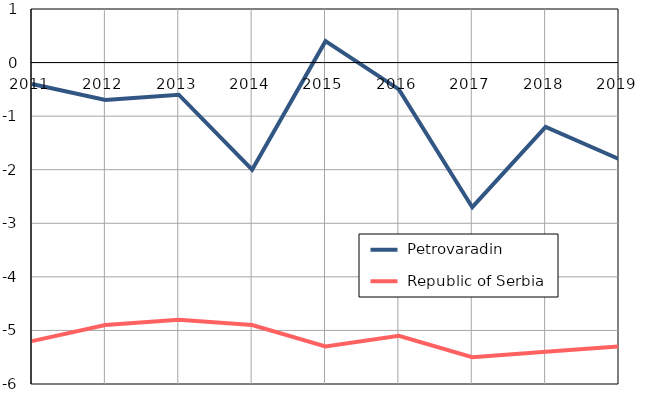
| Category |  Petrovaradin |  Republic of Serbia |
|---|---|---|
| 2011.0 | -0.4 | -5.2 |
| 2012.0 | -0.7 | -4.9 |
| 2013.0 | -0.6 | -4.8 |
| 2014.0 | -2 | -4.9 |
| 2015.0 | 0.4 | -5.3 |
| 2016.0 | -0.5 | -5.1 |
| 2017.0 | -2.7 | -5.5 |
| 2018.0 | -1.2 | -5.4 |
| 2019.0 | -1.8 | -5.3 |